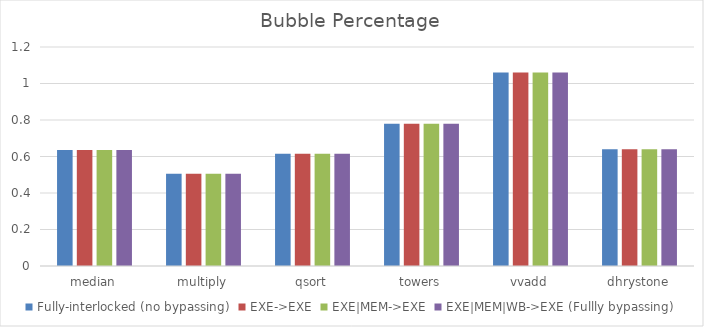
| Category | Fully-interlocked (no bypassing) | EXE->EXE | EXE|MEM->EXE | EXE|MEM|WB->EXE (Fullly bypassing) |
|---|---|---|---|---|
| median | 0.635 | 0.635 | 0.635 | 0.635 |
| multiply | 0.505 | 0.505 | 0.505 | 0.505 |
| qsort | 0.615 | 0.615 | 0.615 | 0.615 |
| towers | 0.78 | 0.78 | 0.78 | 0.78 |
| vvadd | 1.06 | 1.06 | 1.06 | 1.06 |
| dhrystone | 0.64 | 0.64 | 0.64 | 0.64 |